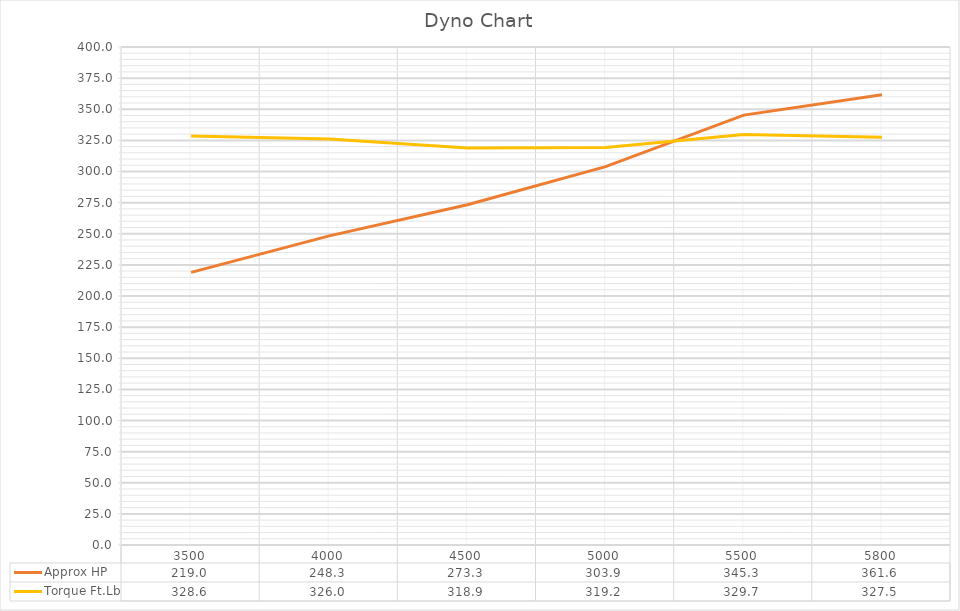
| Category | Approx HP | Torque Ft.Lb |
|---|---|---|
| 3500.0 | 218.971 | 328.589 |
| 4000.0 | 248.306 | 326.033 |
| 4500.0 | 273.261 | 318.933 |
| 5000.0 | 303.894 | 319.217 |
| 5500.0 | 345.287 | 329.725 |
| 5800.0 | 361.612 | 327.453 |